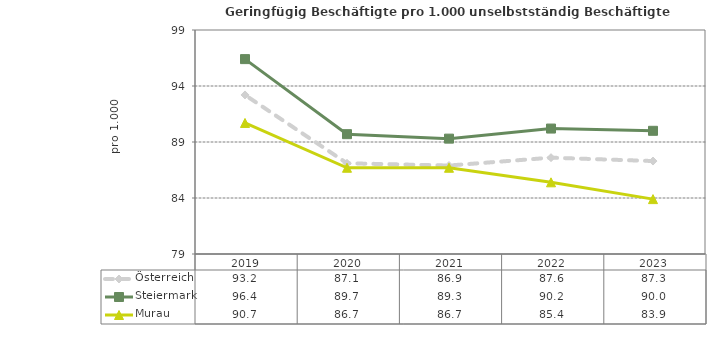
| Category | Österreich | Steiermark | Murau |
|---|---|---|---|
| 2023.0 | 87.3 | 90 | 83.9 |
| 2022.0 | 87.6 | 90.2 | 85.4 |
| 2021.0 | 86.9 | 89.3 | 86.7 |
| 2020.0 | 87.1 | 89.7 | 86.7 |
| 2019.0 | 93.2 | 96.4 | 90.7 |